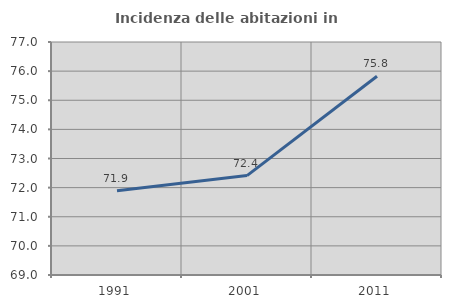
| Category | Incidenza delle abitazioni in proprietà  |
|---|---|
| 1991.0 | 71.895 |
| 2001.0 | 72.414 |
| 2011.0 | 75.824 |